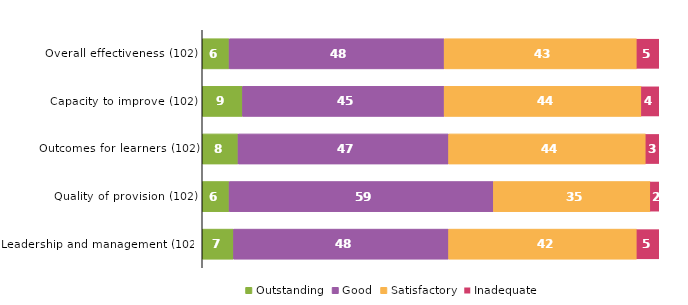
| Category | Outstanding | Good | Satisfactory | Inadequate |
|---|---|---|---|---|
| Overall effectiveness (102) | 6 | 48 | 43 | 5 |
| Capacity to improve (102) | 9 | 45 | 44 | 4 |
| Outcomes for learners (102) | 8 | 47 | 44 | 3 |
| Quality of provision (102) | 6 | 59 | 35 | 2 |
| Leadership and management (102) | 7 | 48 | 42 | 5 |